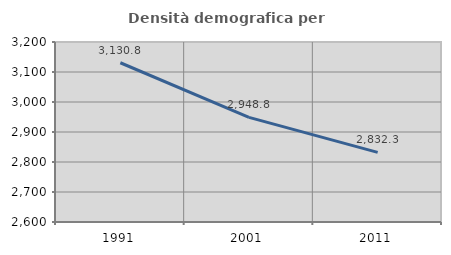
| Category | Densità demografica |
|---|---|
| 1991.0 | 3130.83 |
| 2001.0 | 2948.836 |
| 2011.0 | 2832.253 |